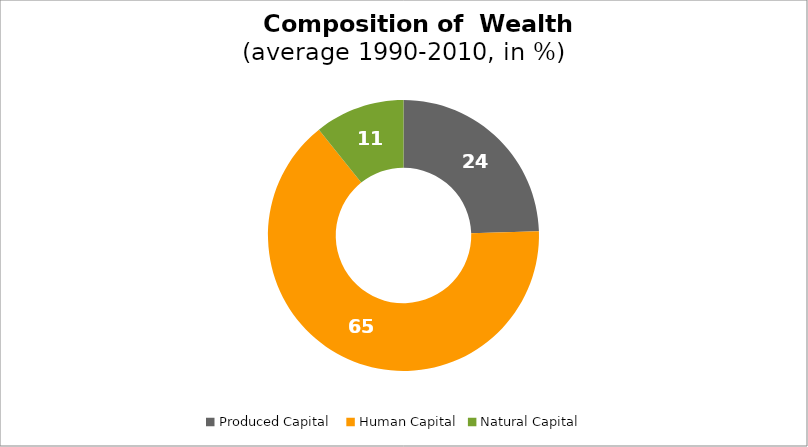
| Category | Series 0 |
|---|---|
| Produced Capital  | 24.496 |
| Human Capital | 64.774 |
| Natural Capital | 10.73 |